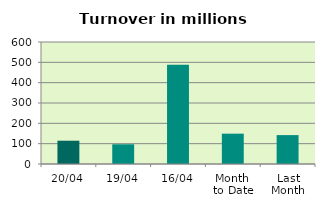
| Category | Series 0 |
|---|---|
| 20/04 | 114.542 |
| 19/04 | 96.929 |
| 16/04 | 487.816 |
| Month 
to Date | 149.213 |
| Last
Month | 142.086 |